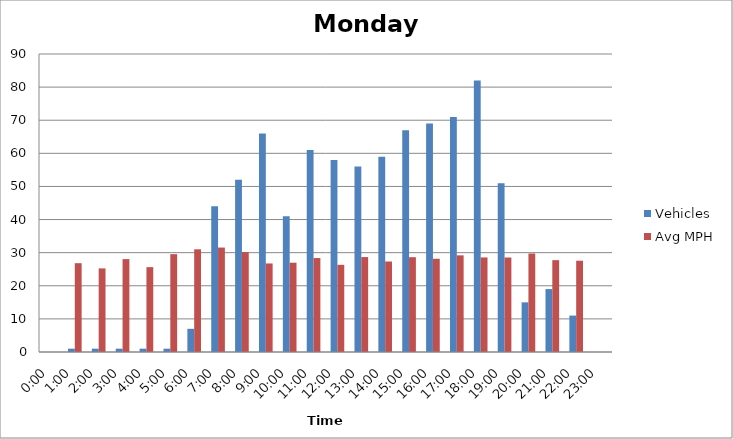
| Category | Vehicles | Avg MPH |
|---|---|---|
| 0:00 | 0 | 0 |
| 1:00 | 1 | 26.82 |
| 2:00 | 1 | 25.25 |
| 3:00 | 1 | 28.06 |
| 4:00 | 1 | 25.63 |
| 5:00 | 1 | 29.55 |
| 6:00 | 7 | 31.02 |
| 7:00 | 44 | 31.54 |
| 8:00 | 52 | 30.18 |
| 9:00 | 66 | 26.74 |
| 10:00 | 41 | 26.97 |
| 11:00 | 61 | 28.38 |
| 12:00 | 58 | 26.33 |
| 13:00 | 56 | 28.67 |
| 14:00 | 59 | 27.33 |
| 15:00 | 67 | 28.63 |
| 16:00 | 69 | 28.16 |
| 17:00 | 71 | 29.19 |
| 18:00 | 82 | 28.56 |
| 19:00 | 51 | 28.54 |
| 20:00 | 15 | 29.74 |
| 21:00 | 19 | 27.74 |
| 22:00 | 11 | 27.57 |
| 23:00 | 0 | 0 |